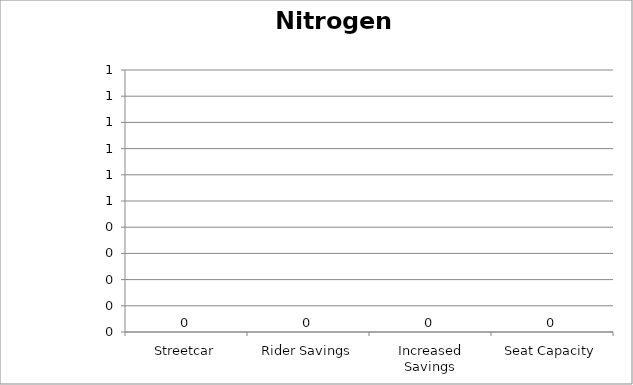
| Category | Nitrogen Oxides |
|---|---|
| Streetcar | 0 |
| Rider Savings | 0 |
| Increased Savings | 0 |
| Seat Capacity | 0 |